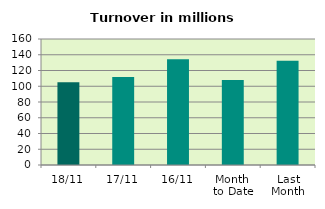
| Category | Series 0 |
|---|---|
| 18/11 | 105.153 |
| 17/11 | 111.673 |
| 16/11 | 134.297 |
| Month 
to Date | 107.903 |
| Last
Month | 132.268 |